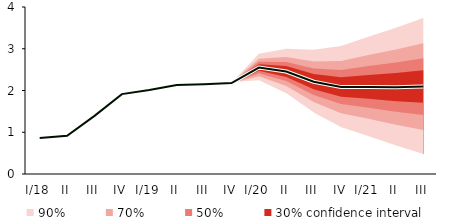
| Category | linka | Centerline |
|---|---|---|
| I/18 | 0.86 | 0.86 |
| II | 0.916 | 0.916 |
| III | 1.393 | 1.393 |
| IV | 1.913 | 1.913 |
| I/19 | 2.013 | 2.013 |
| II | 2.13 | 2.13 |
| III | 2.15 | 2.15 |
| IV | 2.178 | 2.178 |
| I/20 | 2.55 | 2.55 |
| II | 2.455 | 2.455 |
| III | 2.211 | 2.211 |
| IV | 2.082 | 2.082 |
| I/21 | 2.086 | 2.086 |
| II | 2.079 | 2.079 |
| III | 2.094 | 2.094 |